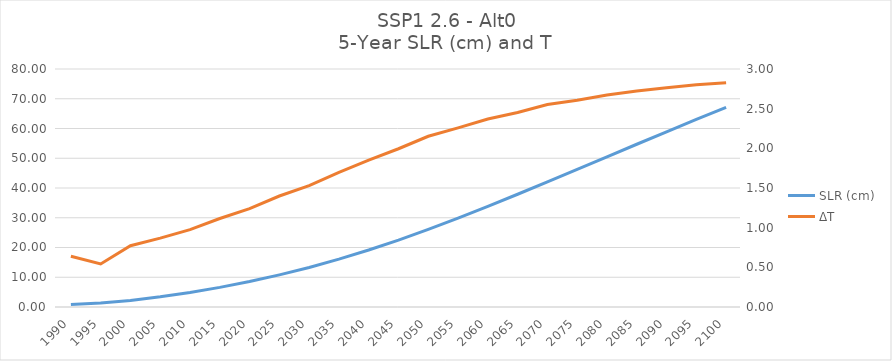
| Category | SLR (cm) |
|---|---|
| 1990.0 | 0.851 |
| 1995.0 | 1.315 |
| 2000.0 | 2.215 |
| 2005.0 | 3.412 |
| 2010.0 | 4.865 |
| 2015.0 | 6.592 |
| 2020.0 | 8.555 |
| 2025.0 | 10.811 |
| 2030.0 | 13.3 |
| 2035.0 | 16.097 |
| 2040.0 | 19.173 |
| 2045.0 | 22.504 |
| 2050.0 | 26.121 |
| 2055.0 | 29.901 |
| 2060.0 | 33.853 |
| 2065.0 | 37.899 |
| 2070.0 | 42.077 |
| 2075.0 | 46.267 |
| 2080.0 | 50.489 |
| 2085.0 | 54.708 |
| 2090.0 | 58.898 |
| 2095.0 | 63.046 |
| 2100.0 | 67.117 |